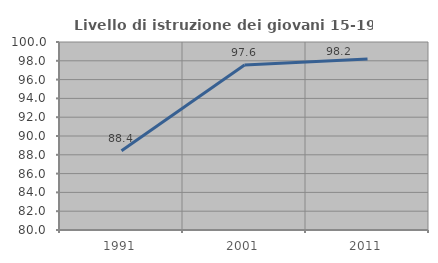
| Category | Livello di istruzione dei giovani 15-19 anni |
|---|---|
| 1991.0 | 88.425 |
| 2001.0 | 97.561 |
| 2011.0 | 98.201 |